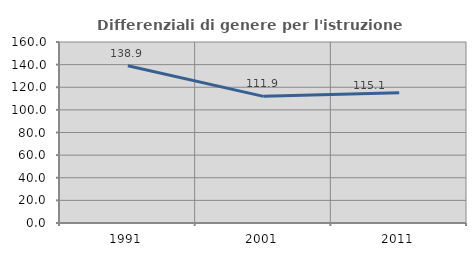
| Category | Differenziali di genere per l'istruzione superiore |
|---|---|
| 1991.0 | 138.943 |
| 2001.0 | 111.946 |
| 2011.0 | 115.052 |